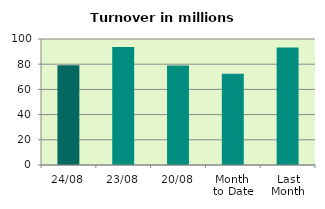
| Category | Series 0 |
|---|---|
| 24/08 | 79.235 |
| 23/08 | 93.643 |
| 20/08 | 79.008 |
| Month 
to Date | 72.477 |
| Last
Month | 93.279 |